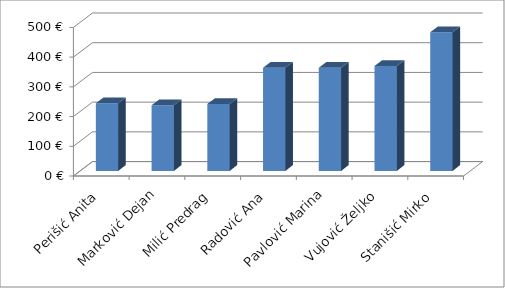
| Category | Series 0 |
|---|---|
| Perišić Anita | 227.264 |
| Marković Dejan | 220.832 |
| Milić Predrag | 225.12 |
| Radović Ana | 346.68 |
| Pavlović Marina | 346.68 |
| Vujović Željko | 353.16 |
| Stanišić Mirko | 466.56 |